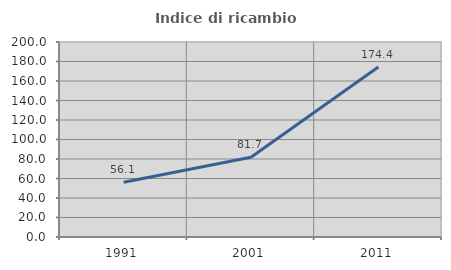
| Category | Indice di ricambio occupazionale  |
|---|---|
| 1991.0 | 56.143 |
| 2001.0 | 81.732 |
| 2011.0 | 174.414 |